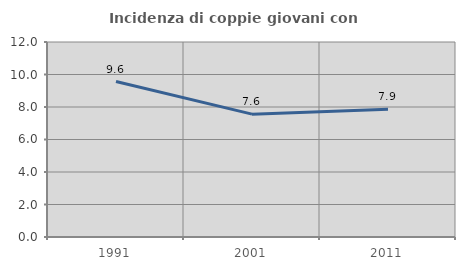
| Category | Incidenza di coppie giovani con figli |
|---|---|
| 1991.0 | 9.569 |
| 2001.0 | 7.561 |
| 2011.0 | 7.857 |